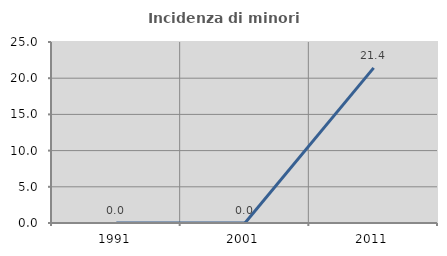
| Category | Incidenza di minori stranieri |
|---|---|
| 1991.0 | 0 |
| 2001.0 | 0 |
| 2011.0 | 21.429 |